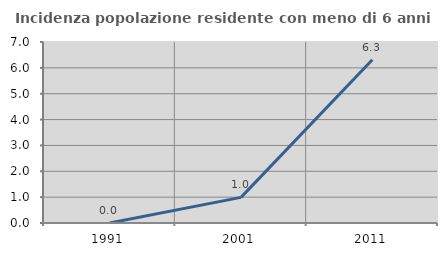
| Category | Incidenza popolazione residente con meno di 6 anni |
|---|---|
| 1991.0 | 0 |
| 2001.0 | 0.99 |
| 2011.0 | 6.316 |